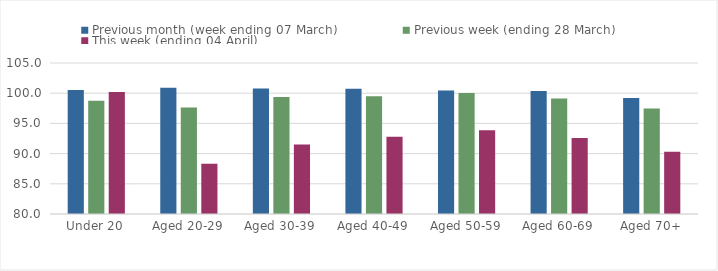
| Category | Previous month (week ending 07 March) | Previous week (ending 28 March) | This week (ending 04 April) |
|---|---|---|---|
| Under 20 | 100.538 | 98.747 | 100.201 |
| Aged 20-29 | 100.902 | 97.618 | 88.322 |
| Aged 30-39 | 100.794 | 99.354 | 91.497 |
| Aged 40-49 | 100.753 | 99.5 | 92.791 |
| Aged 50-59 | 100.462 | 100.032 | 93.863 |
| Aged 60-69 | 100.35 | 99.14 | 92.591 |
| Aged 70+ | 99.196 | 97.471 | 90.307 |